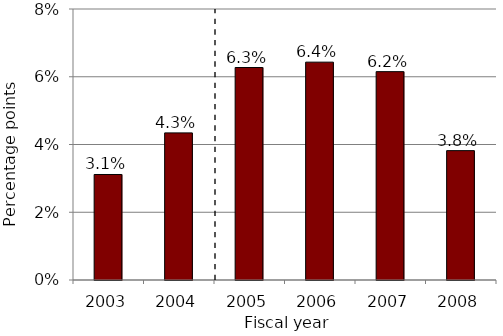
| Category | ERSRI (reform in 2005) |
|---|---|
| 2003.0 | 3.114 |
| 2004.0 | 4.343 |
| 2005.0 | 6.272 |
| 2006.0 | 6.431 |
| 2007.0 | 6.151 |
| 2008.0 | 3.819 |